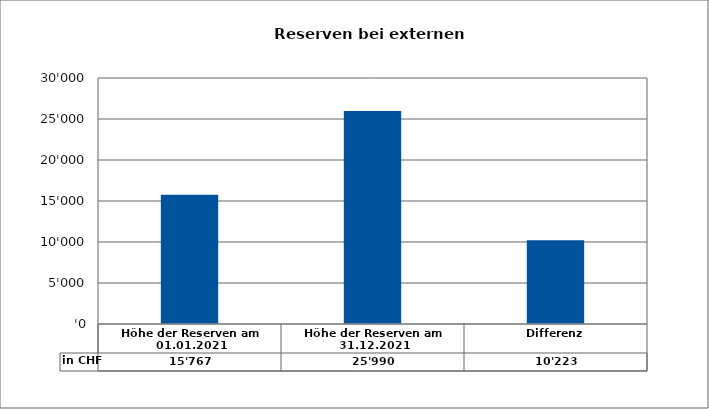
| Category | in CHF |
|---|---|
| Höhe der Reserven am 01.01.2021 | 15767.35 |
| Höhe der Reserven am 31.12.2021 | 25990.11 |
| Differenz | 10222.76 |